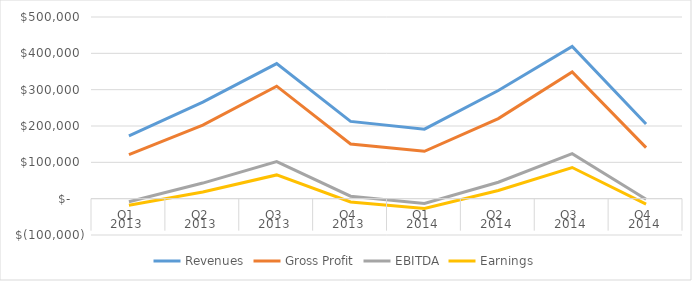
| Category | Revenues | Gross Profit | EBITDA | Earnings |
|---|---|---|---|---|
| 0 | 173045 | 120959 | -8314 | -18289 |
| 1 | 265600 | 202407 | 42936 | 18490 |
| 2 | 371662 | 309642 | 102241 | 65325 |
| 3 | 212650 | 150517 | 6847 | -9108 |
| 4 | 191277 | 130388 | -13304 | -26721 |
| 5 | 297793 | 220388 | 45240 | 22393 |
| 6 | 418746 | 348993 | 123883 | 85801 |
| 7 | 205481 | 140367 | -1481 | -14974 |